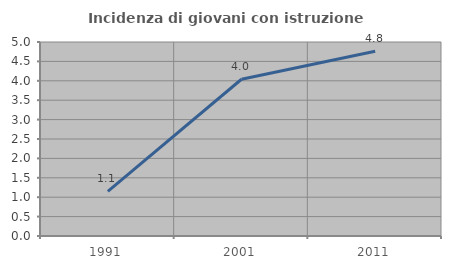
| Category | Incidenza di giovani con istruzione universitaria |
|---|---|
| 1991.0 | 1.149 |
| 2001.0 | 4.04 |
| 2011.0 | 4.762 |